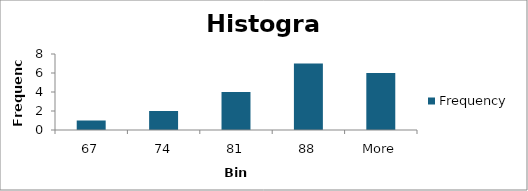
| Category | Frequency |
|---|---|
| 67 | 1 |
| 74 | 2 |
| 81 | 4 |
| 88 | 7 |
| More | 6 |